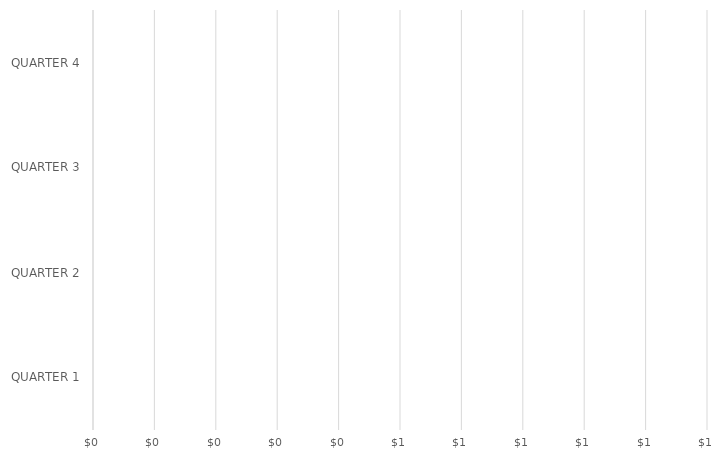
| Category | Series 0 |
|---|---|
| QUARTER 1 | 0 |
| QUARTER 2 | 0 |
| QUARTER 3 | 0 |
| QUARTER 4 | 0 |